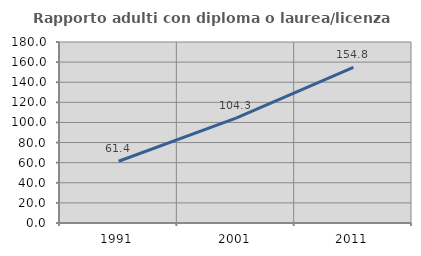
| Category | Rapporto adulti con diploma o laurea/licenza media  |
|---|---|
| 1991.0 | 61.415 |
| 2001.0 | 104.255 |
| 2011.0 | 154.822 |